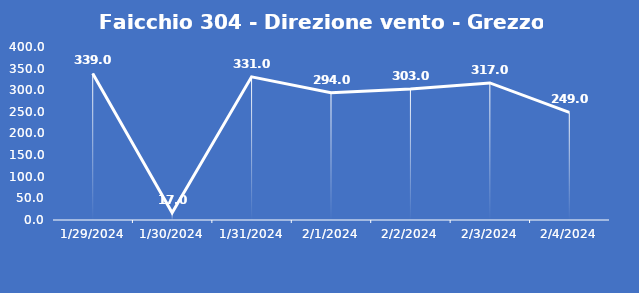
| Category | Faicchio 304 - Direzione vento - Grezzo (°N) |
|---|---|
| 1/29/24 | 339 |
| 1/30/24 | 17 |
| 1/31/24 | 331 |
| 2/1/24 | 294 |
| 2/2/24 | 303 |
| 2/3/24 | 317 |
| 2/4/24 | 249 |